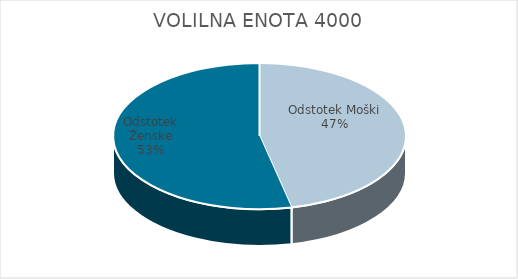
| Category | VOLILNA ENOTA 4000 | #REF! | Slovenija skupaj |
|---|---|---|---|
| Odstotek Moški | 25.34 |  | 24.13 |
| Odstotek Ženske | 29.15 |  | 27.06 |